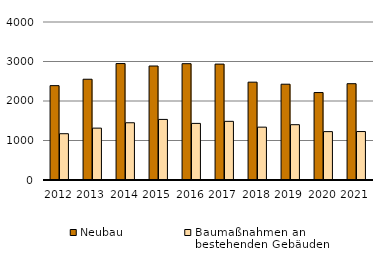
| Category | Neubau | Baumaßnahmen an 
bestehenden Gebäuden |
|---|---|---|
| 2012.0 | 2389 | 1172 |
| 2013.0 | 2551 | 1313 |
| 2014.0 | 2948 | 1449 |
| 2015.0 | 2886 | 1534 |
| 2016.0 | 2945 | 1433 |
| 2017.0 | 2934 | 1485 |
| 2018.0 | 2477 | 1338 |
| 2019.0 | 2425 | 1400 |
| 2020.0 | 2214 | 1225 |
| 2021.0 | 2438 | 1227 |